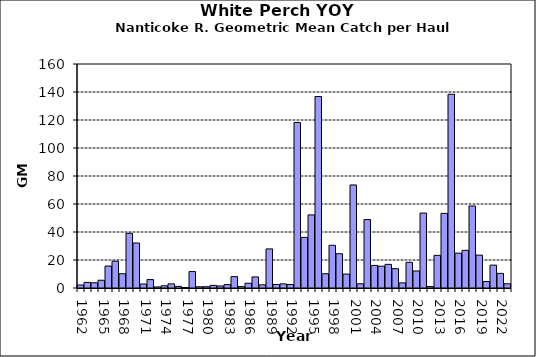
| Category | Series 0 |
|---|---|
| 1962.0 | 2.15 |
| 1963.0 | 3.989 |
| 1964.0 | 3.727 |
| 1965.0 | 5.544 |
| 1966.0 | 15.713 |
| 1967.0 | 19.122 |
| 1968.0 | 10.18 |
| 1969.0 | 39.063 |
| 1970.0 | 32.135 |
| 1971.0 | 2.836 |
| 1972.0 | 6.008 |
| 1973.0 | 0.74 |
| 1974.0 | 1.578 |
| 1975.0 | 2.944 |
| 1976.0 | 1.15 |
| 1977.0 | 0.364 |
| 1978.0 | 11.735 |
| 1979.0 | 0.904 |
| 1980.0 | 0.912 |
| 1981.0 | 1.866 |
| 1982.0 | 1.464 |
| 1983.0 | 2.433 |
| 1984.0 | 8.123 |
| 1985.0 | 1.002 |
| 1986.0 | 3.413 |
| 1987.0 | 7.912 |
| 1988.0 | 2.248 |
| 1989.0 | 27.92 |
| 1990.0 | 2.508 |
| 1991.0 | 2.936 |
| 1992.0 | 2.513 |
| 1993.0 | 118.217 |
| 1994.0 | 36.175 |
| 1995.0 | 52.2 |
| 1996.0 | 136.757 |
| 1997.0 | 10.176 |
| 1998.0 | 30.494 |
| 1999.0 | 24.468 |
| 2000.0 | 9.952 |
| 2001.0 | 73.587 |
| 2002.0 | 2.987 |
| 2003.0 | 48.867 |
| 2004.0 | 16.12 |
| 2005.0 | 15.57 |
| 2006.0 | 16.893 |
| 2007.0 | 13.811 |
| 2008.0 | 3.683 |
| 2009.0 | 18.339 |
| 2010.0 | 12.156 |
| 2011.0 | 53.541 |
| 2012.0 | 1.004 |
| 2013.0 | 23.294 |
| 2014.0 | 53.302 |
| 2015.0 | 138.365 |
| 2016.0 | 24.885 |
| 2017.0 | 26.904 |
| 2018.0 | 58.562 |
| 2019.0 | 23.472 |
| 2020.0 | 4.6 |
| 2021.0 | 16.329 |
| 2022.0 | 10.447 |
| 2023.0 | 3.023 |